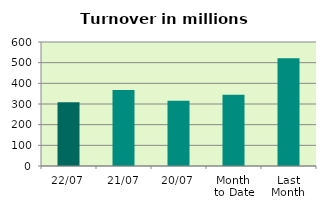
| Category | Series 0 |
|---|---|
| 22/07 | 308.654 |
| 21/07 | 368.153 |
| 20/07 | 316.001 |
| Month 
to Date | 344.868 |
| Last
Month | 521.023 |